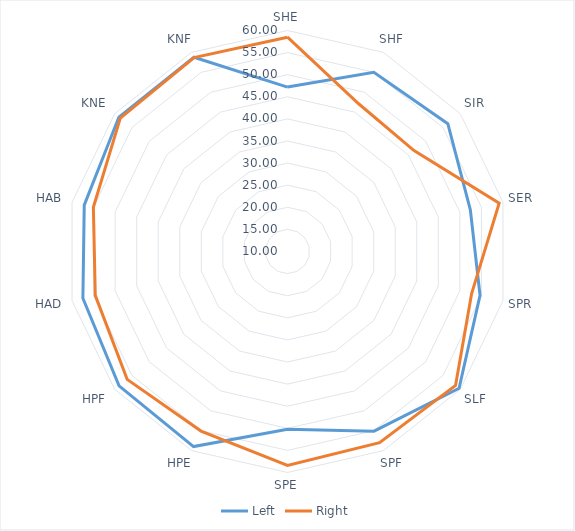
| Category | Left | Right |
|---|---|---|
| SHE | 47.2 | 58.49 |
| SHF | 55.02 | 47.1 |
| SIR | 56.39 | 46.61 |
| SER | 52.43 | 59.12 |
| SPR | 54.68 | 52.73 |
| SLF | 59.65 | 58.63 |
| SPF | 55.12 | 58.02 |
| SPE | 50.22 | 58.39 |
| HPE | 58.98 | 55.09 |
| HPF | 58.74 | 56.4 |
| HAD | 57.48 | 54.61 |
| HAB | 57.17 | 55.05 |
| KNE | 58.78 | 58.38 |
| KNF | 58.78 | 58.71 |